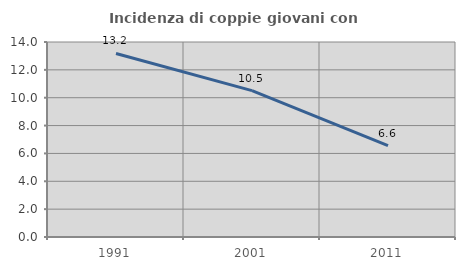
| Category | Incidenza di coppie giovani con figli |
|---|---|
| 1991.0 | 13.178 |
| 2001.0 | 10.506 |
| 2011.0 | 6.557 |